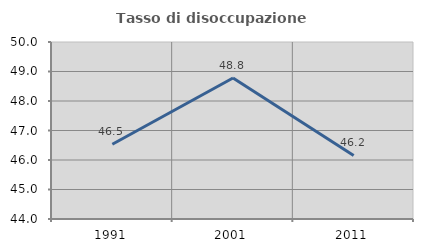
| Category | Tasso di disoccupazione giovanile  |
|---|---|
| 1991.0 | 46.535 |
| 2001.0 | 48.78 |
| 2011.0 | 46.154 |